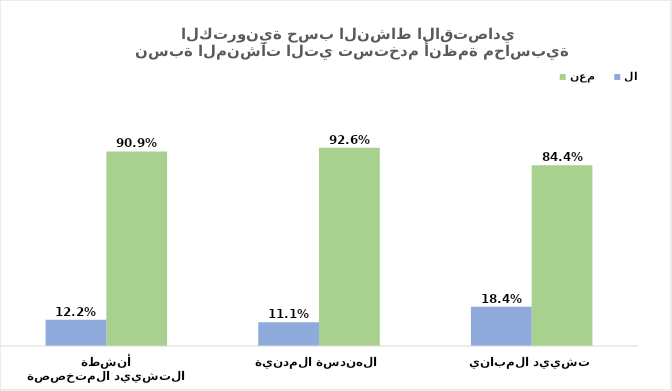
| Category | نعم | لا |
|---|---|---|
| تشييد المباني | 0.844 | 0.184 |
| الهندسة المدنية | 0.926 | 0.111 |
| أنشطة التشييد المتخصصة | 0.909 | 0.122 |